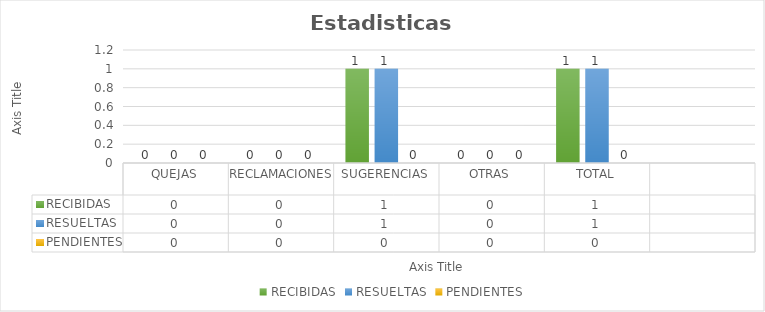
| Category | RECIBIDAS | RESUELTAS | PENDIENTES |
|---|---|---|---|
| QUEJAS | 0 | 0 | 0 |
| RECLAMACIONES | 0 | 0 | 0 |
| SUGERENCIAS | 1 | 1 | 0 |
| OTRAS | 0 | 0 | 0 |
| TOTAL | 1 | 1 | 0 |